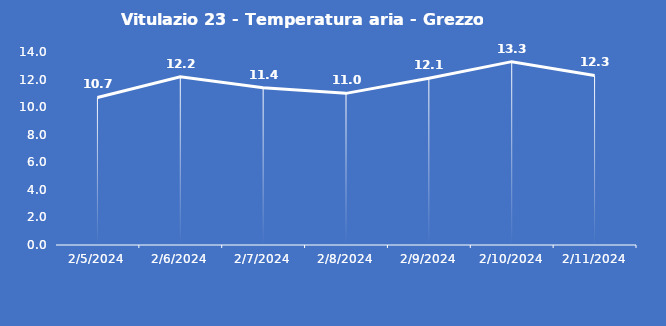
| Category | Vitulazio 23 - Temperatura aria - Grezzo (°C) |
|---|---|
| 2/5/24 | 10.7 |
| 2/6/24 | 12.2 |
| 2/7/24 | 11.4 |
| 2/8/24 | 11 |
| 2/9/24 | 12.1 |
| 2/10/24 | 13.3 |
| 2/11/24 | 12.3 |